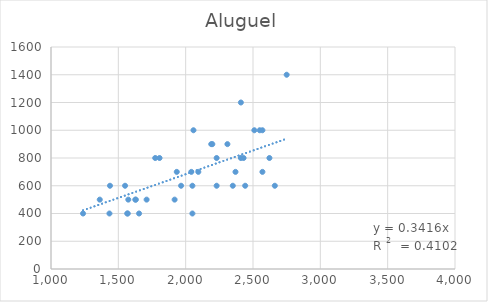
| Category | Aluguel |
|---|---|
| 1550.0 | 600 |
| 2310.0 | 900 |
| 1570.0 | 400 |
| 2042.0 | 700 |
| 1934.0 | 700 |
| 1630.0 | 500 |
| 1574.0 | 500 |
| 1566.0 | 400 |
| 2050.0 | 600 |
| 2350.0 | 600 |
| 1918.0 | 500 |
| 1438.0 | 600 |
| 1654.0 | 400 |
| 2058.0 | 1000 |
| 2442.0 | 600 |
| 2050.0 | 400 |
| 1966.0 | 600 |
| 2550.0 | 1000 |
| 2198.0 | 900 |
| 1626.0 | 500 |
| 2510.0 | 1000 |
| 2410.0 | 800 |
| 2622.0 | 800 |
| 1362.0 | 500 |
| 2750.0 | 1400 |
| 1806.0 | 800 |
| 2190.0 | 900 |
| 2430.0 | 800 |
| 2094.0 | 700 |
| 2570.0 | 700 |
| 2410.0 | 1200 |
| 1774.0 | 800 |
| 1710.0 | 500 |
| 2370.0 | 700 |
| 2230.0 | 800 |
| 2570.0 | 1000 |
| 2662.0 | 600 |
| 1238.0 | 400 |
| 2230.0 | 600 |
| 1434.0 | 400 |